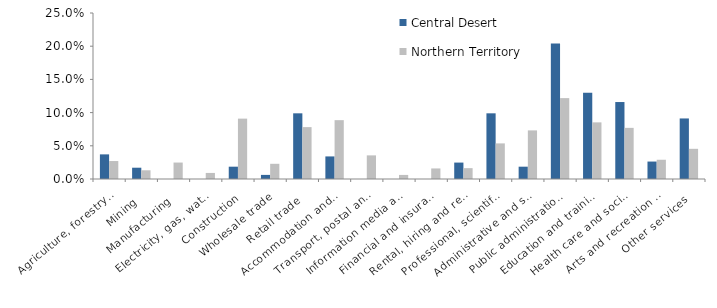
| Category | Central Desert | Northern Territory |
|---|---|---|
| Agriculture, forestry and fishing | 0.037 | 0.027 |
| Mining | 0.017 | 0.013 |
| Manufacturing | 0 | 0.025 |
| Electricity, gas, water and waste services | 0 | 0.009 |
| Construction | 0.019 | 0.091 |
| Wholesale trade | 0.006 | 0.023 |
| Retail trade | 0.099 | 0.078 |
| Accommodation and food services | 0.034 | 0.089 |
| Transport, postal and warehousing | 0 | 0.036 |
| Information media and telecommunications | 0 | 0.006 |
| Financial and insurance services | 0 | 0.016 |
| Rental, hiring and real estate services | 0.025 | 0.016 |
| Professional, scientific and technical services | 0.099 | 0.054 |
| Administrative and support services | 0.019 | 0.073 |
| Public administration and safety | 0.204 | 0.122 |
| Education and training | 0.13 | 0.085 |
| Health care and social assistance | 0.116 | 0.077 |
| Arts and recreation services | 0.026 | 0.029 |
| Other services | 0.091 | 0.045 |